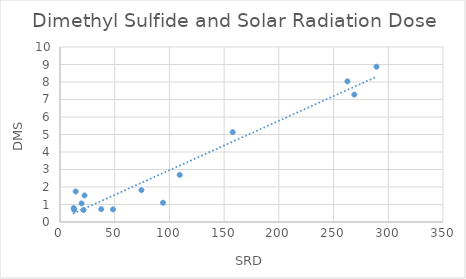
| Category | DMS |
|---|---|
| 12.55 | 0.796 |
| 12.91 | 0.692 |
| 14.34 | 1.744 |
| 19.72 | 1.062 |
| 21.52 | 0.682 |
| 22.41 | 1.517 |
| 37.65 | 0.736 |
| 48.41 | 0.72 |
| 74.41 | 1.82 |
| 94.14 | 1.099 |
| 109.38 | 2.692 |
| 157.79 | 5.134 |
| 262.67 | 8.038 |
| 268.96 | 7.28 |
| 289.23 | 8.872 |